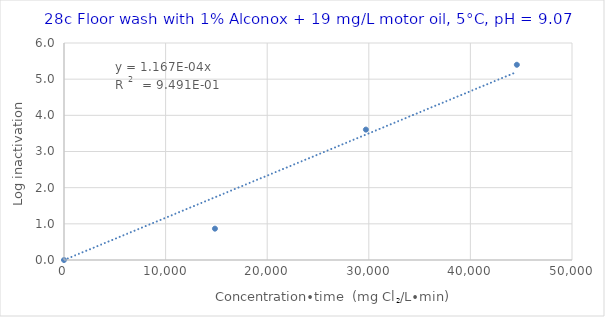
| Category | Series 0 |
|---|---|
| 0.0 | 0 |
| 14857.428714357178 | 0.866 |
| 29714.857428714357 | 3.606 |
| 44572.286143071535 | 5.398 |